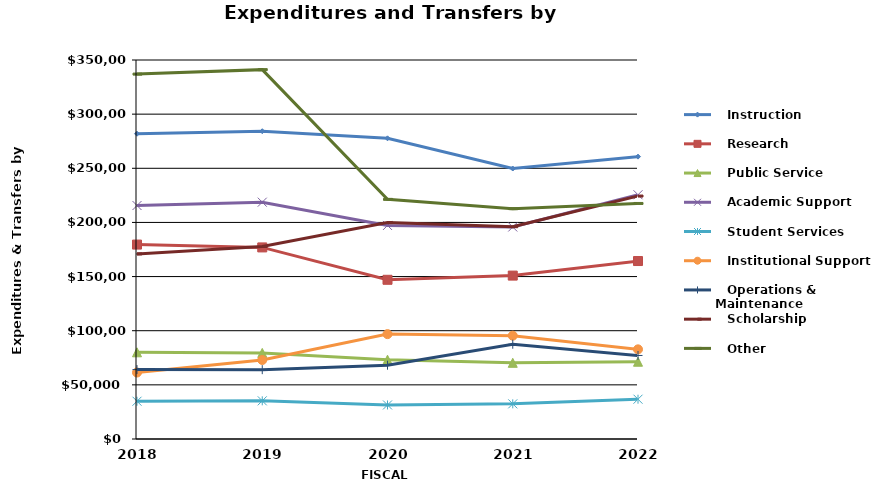
| Category |    Instruction |    Research |    Public Service |    Academic Support |    Student Services |    Institutional Support |    Operations & Maintenance |    Scholarship |    Other |
|---|---|---|---|---|---|---|---|---|---|
| 2018.0 | 281901 | 179547 | 80056 | 215610 | 34883 | 61388 | 64103 | 170941 | 336973 |
| 2019.0 | 284225 | 176924 | 79518 | 218697 | 35240 | 72961 | 64031 | 177815 | 341098 |
| 2020.0 | 277672 | 147031 | 73248 | 197224 | 31438 | 96854 | 68164 | 199854 | 221299 |
| 2021.0 | 249774 | 150892 | 70362 | 195785 | 32456 | 95426 | 87511 | 196059 | 212718 |
| 2022.0 | 260761 | 164348 | 71358 | 225552 | 36743 | 82794 | 77137 | 224362 | 217523 |